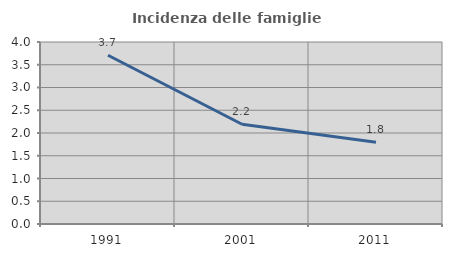
| Category | Incidenza delle famiglie numerose |
|---|---|
| 1991.0 | 3.709 |
| 2001.0 | 2.192 |
| 2011.0 | 1.796 |